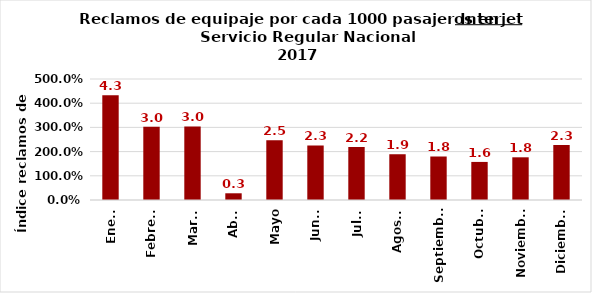
| Category | Reclamos por cada 1000 pasajeros |
|---|---|
| Enero | 4.328 |
| Febrero | 3.026 |
| Marzo | 3.038 |
| Abril | 0.278 |
| Mayo | 2.466 |
| Junio | 2.255 |
| Julio | 2.189 |
| Agosto | 1.891 |
| Septiembre | 1.798 |
| Octubre | 1.573 |
| Noviembre | 1.764 |
| Diciembre | 2.269 |